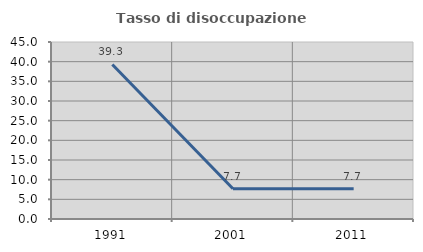
| Category | Tasso di disoccupazione giovanile  |
|---|---|
| 1991.0 | 39.286 |
| 2001.0 | 7.692 |
| 2011.0 | 7.692 |